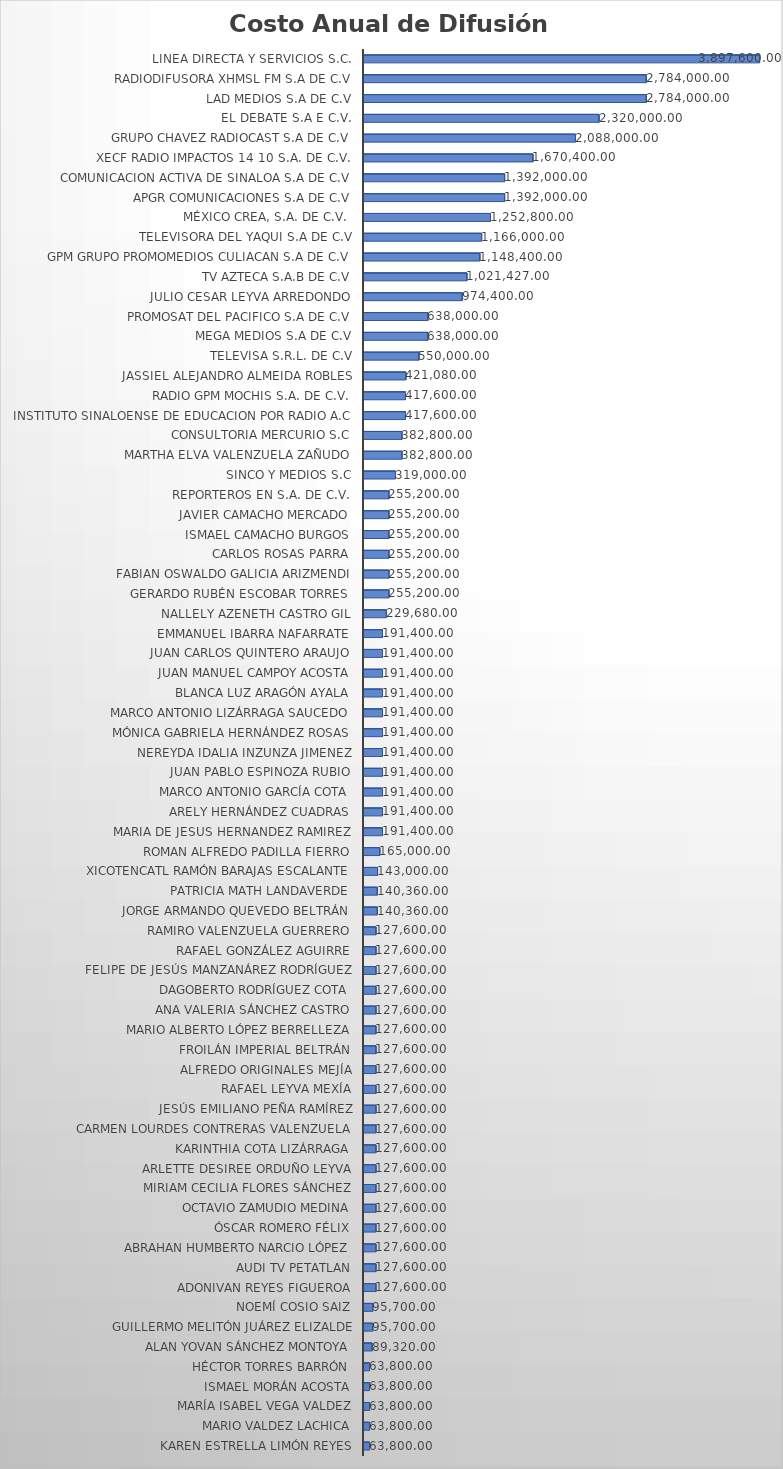
| Category | Costo Anual  |
|---|---|
| KAREN ESTRELLA LIMÓN REYES | 63800 |
| MARIO VALDEZ LACHICA | 63800 |
| MARÍA ISABEL VEGA VALDEZ | 63800 |
| ISMAEL MORÁN ACOSTA | 63800 |
| HÉCTOR TORRES BARRÓN | 63800 |
| ALAN YOVAN SÁNCHEZ MONTOYA | 89320 |
| GUILLERMO MELITÓN JUÁREZ ELIZALDE | 95700 |
| NOEMÍ COSIO SAIZ | 95700 |
| ADONIVAN REYES FIGUEROA | 127600 |
| AUDI TV PETATLAN | 127600 |
| ABRAHAN HUMBERTO NARCIO LÓPEZ | 127600 |
| ÓSCAR ROMERO FÉLIX | 127600 |
| OCTAVIO ZAMUDIO MEDINA | 127600 |
| MIRIAM CECILIA FLORES SÁNCHEZ | 127600 |
| ARLETTE DESIREE ORDUÑO LEYVA | 127600 |
| KARINTHIA COTA LIZÁRRAGA | 127600 |
| CARMEN LOURDES CONTRERAS VALENZUELA | 127600 |
| JESÚS EMILIANO PEÑA RAMÍREZ | 127600 |
| RAFAEL LEYVA MEXÍA | 127600 |
| ALFREDO ORIGINALES MEJÍA | 127600 |
| FROILÁN IMPERIAL BELTRÁN | 127600 |
| MARIO ALBERTO LÓPEZ BERRELLEZA | 127600 |
| ANA VALERIA SÁNCHEZ CASTRO | 127600 |
| DAGOBERTO RODRÍGUEZ COTA | 127600 |
| FELIPE DE JESÚS MANZANÁREZ RODRÍGUEZ | 127600 |
| RAFAEL GONZÁLEZ AGUIRRE | 127600 |
| RAMIRO VALENZUELA GUERRERO | 127600 |
| JORGE ARMANDO QUEVEDO BELTRÁN | 140360 |
| PATRICIA MATH LANDAVERDE | 140360 |
| XICOTENCATL RAMÓN BARAJAS ESCALANTE | 143000 |
| ROMAN ALFREDO PADILLA FIERRO | 165000 |
| MARIA DE JESUS HERNANDEZ RAMIREZ | 191400 |
| ARELY HERNÁNDEZ CUADRAS | 191400 |
| MARCO ANTONIO GARCÍA COTA | 191400 |
| JUAN PABLO ESPINOZA RUBIO | 191400 |
| NEREYDA IDALIA INZUNZA JIMENEZ | 191400 |
| MÓNICA GABRIELA HERNÁNDEZ ROSAS | 191400 |
| MARCO ANTONIO LIZÁRRAGA SAUCEDO | 191400 |
| BLANCA LUZ ARAGÓN AYALA | 191400 |
| JUAN MANUEL CAMPOY ACOSTA | 191400 |
| JUAN CARLOS QUINTERO ARAUJO | 191400 |
| EMMANUEL IBARRA NAFARRATE | 191400 |
| NALLELY AZENETH CASTRO GIL | 229680 |
| GERARDO RUBÉN ESCOBAR TORRES | 255200 |
| FABIAN OSWALDO GALICIA ARIZMENDI | 255200 |
| CARLOS ROSAS PARRA | 255200 |
| ISMAEL CAMACHO BURGOS | 255200 |
| JAVIER CAMACHO MERCADO | 255200 |
| REPORTEROS EN S.A. DE C.V. | 255200 |
| SINCO Y MEDIOS S.C | 319000 |
| MARTHA ELVA VALENZUELA ZAÑUDO | 382800 |
| CONSULTORIA MERCURIO S.C | 382800 |
| INSTITUTO SINALOENSE DE EDUCACION POR RADIO A.C | 417600 |
| RADIO GPM MOCHIS S.A. DE C.V. | 417600 |
| JASSIEL ALEJANDRO ALMEIDA ROBLES | 421080 |
| TELEVISA S.R.L. DE C.V | 550000 |
| MEGA MEDIOS S.A DE C.V | 638000 |
| PROMOSAT DEL PACIFICO S.A DE C.V | 638000 |
| Julio Cesar Leyva Arredondo | 974400 |
| TV AZTECA S.A.B DE C.V | 1021427 |
| GPM GRUPO PROMOMEDIOS CULIACAN S.A DE C.V | 1148400 |
| TELEVISORA DEL YAQUI S.A DE C.V | 1166000 |
| México Crea, S.A. de C.V.  | 1252800 |
| APGR COMUNICACIONES S.A DE C.V | 1392000 |
| COMUNICACION ACTIVA DE SINALOA S.A DE C.V | 1392000 |
| XECF RADIO IMPACTOS 14 10 S.A. DE C.V. | 1670400 |
| GRUPO CHAVEZ RADIOCAST S.A DE C.V | 2088000 |
| EL DEBATE S.A E C.V. | 2320000 |
| LAD MEDIOS S.A DE C.V | 2784000 |
| RADIODIFUSORA XHMSL FM S.A DE C.V | 2784000 |
| LINEA DIRECTA Y SERVICIOS S.C. | 3897600 |